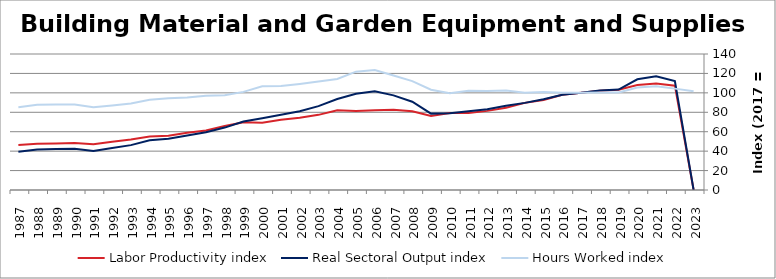
| Category | Labor Productivity index | Real Sectoral Output index | Hours Worked index |
|---|---|---|---|
| 2023.0 | 0 | 0 | 101.651 |
| 2022.0 | 107.371 | 112.049 | 104.357 |
| 2021.0 | 109.538 | 116.957 | 106.773 |
| 2020.0 | 107.971 | 113.965 | 105.551 |
| 2019.0 | 103.114 | 103.404 | 100.281 |
| 2018.0 | 102.105 | 102.397 | 100.286 |
| 2017.0 | 100 | 100 | 100 |
| 2016.0 | 98.094 | 98.114 | 100.02 |
| 2015.0 | 92.658 | 93.471 | 100.877 |
| 2014.0 | 89.698 | 89.694 | 99.996 |
| 2013.0 | 84.675 | 86.732 | 102.429 |
| 2012.0 | 81.458 | 83.06 | 101.967 |
| 2011.0 | 79.332 | 80.98 | 102.078 |
| 2010.0 | 79.379 | 79.117 | 99.67 |
| 2009.0 | 76.16 | 78.624 | 103.236 |
| 2008.0 | 81.086 | 90.92 | 112.128 |
| 2007.0 | 82.622 | 97.442 | 117.937 |
| 2006.0 | 82.21 | 101.535 | 123.508 |
| 2005.0 | 81.359 | 99.121 | 121.831 |
| 2004.0 | 82.025 | 93.713 | 114.25 |
| 2003.0 | 77.352 | 86.339 | 111.618 |
| 2002.0 | 74.285 | 81.082 | 109.149 |
| 2001.0 | 72.307 | 77.409 | 107.057 |
| 2000.0 | 69.154 | 73.859 | 106.804 |
| 1999.0 | 69.827 | 70.533 | 101.011 |
| 1998.0 | 65.807 | 64.25 | 97.635 |
| 1997.0 | 61.217 | 59.439 | 97.096 |
| 1996.0 | 58.878 | 56.019 | 95.144 |
| 1995.0 | 55.809 | 52.677 | 94.389 |
| 1994.0 | 55.04 | 51.102 | 92.846 |
| 1993.0 | 51.872 | 46.2 | 89.065 |
| 1992.0 | 49.766 | 43.329 | 87.065 |
| 1991.0 | 47.179 | 40.228 | 85.266 |
| 1990.0 | 48.378 | 42.568 | 87.989 |
| 1989.0 | 47.872 | 42.099 | 87.942 |
| 1988.0 | 47.566 | 41.684 | 87.635 |
| 1987.0 | 46.237 | 39.405 | 85.225 |